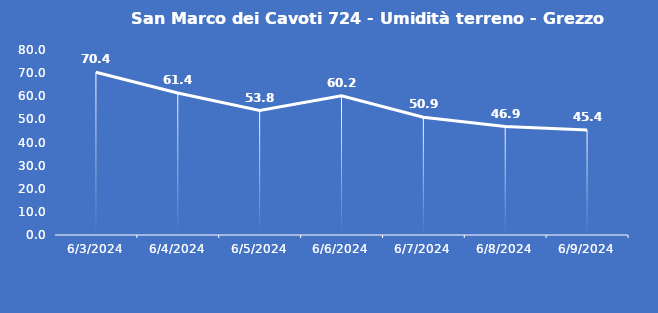
| Category | San Marco dei Cavoti 724 - Umidità terreno - Grezzo (%VWC) |
|---|---|
| 6/3/24 | 70.4 |
| 6/4/24 | 61.4 |
| 6/5/24 | 53.8 |
| 6/6/24 | 60.2 |
| 6/7/24 | 50.9 |
| 6/8/24 | 46.9 |
| 6/9/24 | 45.4 |